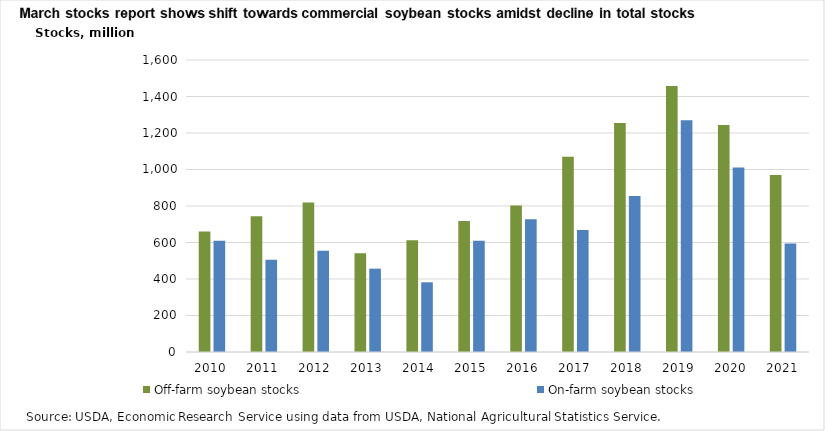
| Category | Off-farm soybean stocks | On-farm soybean stocks |
|---|---|---|
| 2010 | 660868000 | 609200000 |
| 2011 | 743800000 | 505000000 |
| 2012 | 819488000 | 555000000 |
| 2013 | 541320000 | 456700000 |
| 2014 | 611928000 | 381900000 |
| 2015 | 717399000 | 609200000 |
| 2016 | 803406000 | 727500000 |
| 2017 | 1070433000 | 668500000 |
| 2018 | 1254303000 | 855000000 |
| 2019 | 1457069000 | 1270000000 |
| 2020 | 1243382000 | 1011500000 |
| 2021 | 970164000 | 594000000 |